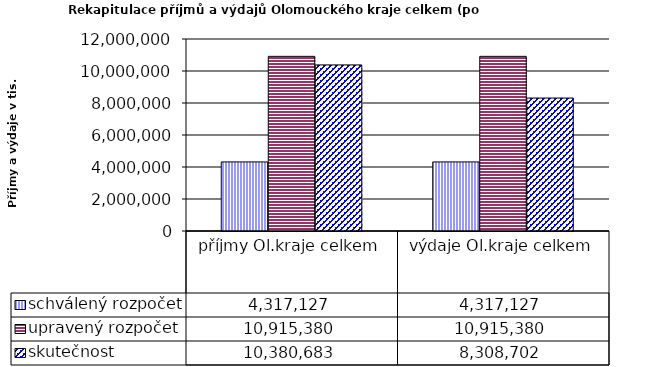
| Category | schválený rozpočet | upravený rozpočet | skutečnost |
|---|---|---|---|
| příjmy Ol.kraje celkem | 4317127 | 10915380 | 10380683 |
| výdaje Ol.kraje celkem | 4317127 | 10915380 | 8308702 |